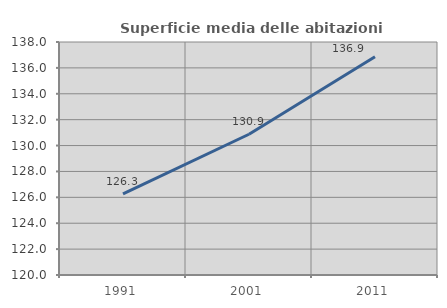
| Category | Superficie media delle abitazioni occupate |
|---|---|
| 1991.0 | 126.274 |
| 2001.0 | 130.872 |
| 2011.0 | 136.865 |